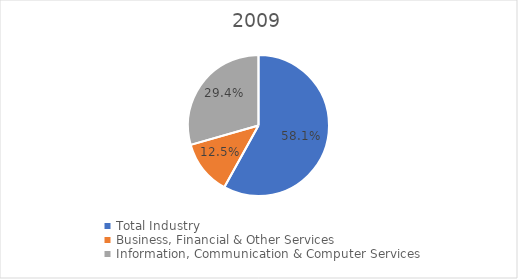
| Category | Series 0 |
|---|---|
| Total Industry | 0.581 |
| Business, Financial & Other Services | 0.125 |
| Information, Communication & Computer Services | 0.294 |